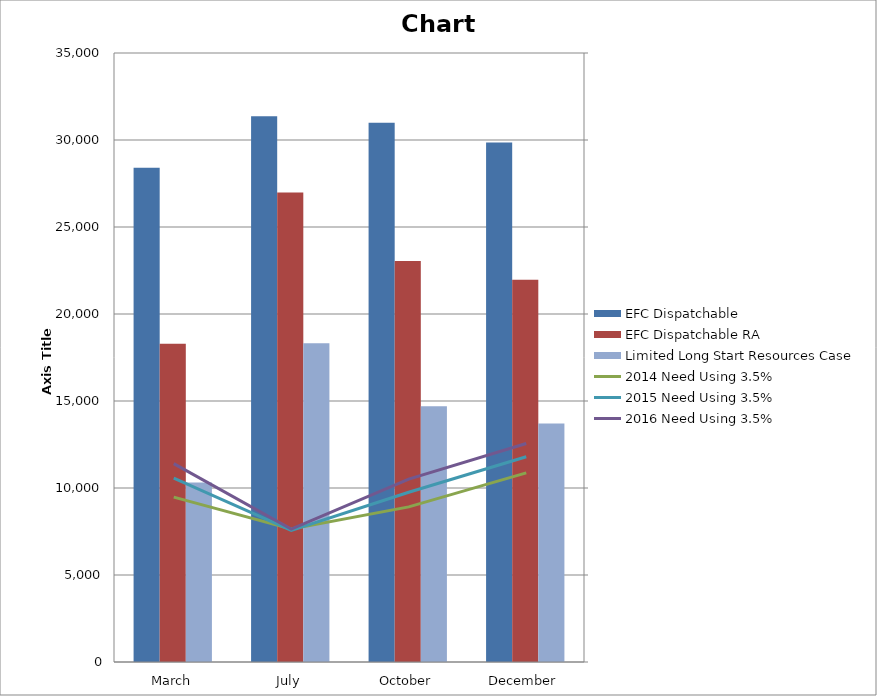
| Category | EFC Dispatchable | EFC Dispatchable RA | Limited Long Start Resources Case |
|---|---|---|---|
| March | 28399.83 | 18284.81 | 10322.025 |
| July | 31363.05 | 26978.99 | 18320.671 |
| October | 30996.54 | 23047.83 | 14704.004 |
| December | 29857.11 | 21964.44 | 13707.285 |